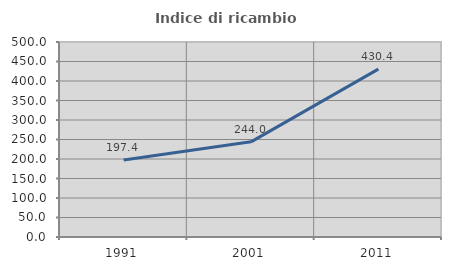
| Category | Indice di ricambio occupazionale  |
|---|---|
| 1991.0 | 197.436 |
| 2001.0 | 244 |
| 2011.0 | 430.435 |